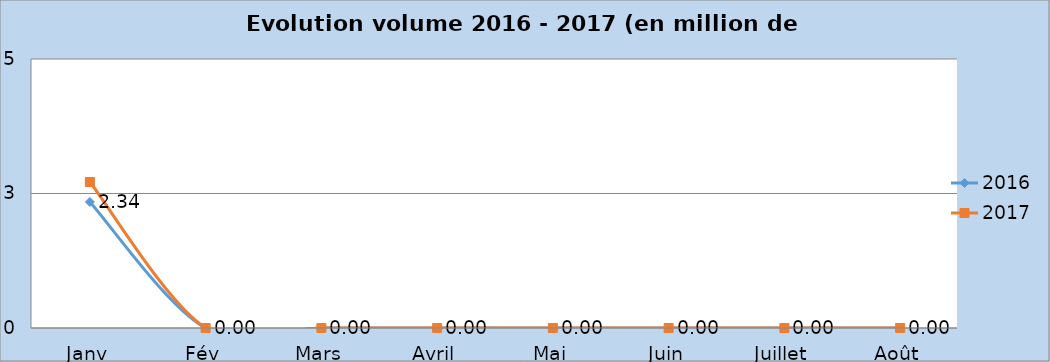
| Category | 2016 | 2017 |
|---|---|---|
| Janv | 2.343 | 2.713 |
| Fév | 0 | 0 |
| Mars | 0 | 0 |
| Avril | 0 | 0 |
| Mai | 0 | 0 |
| Juin | 0 | 0 |
| Juillet | 0 | 0 |
| Août | 0 | 0 |